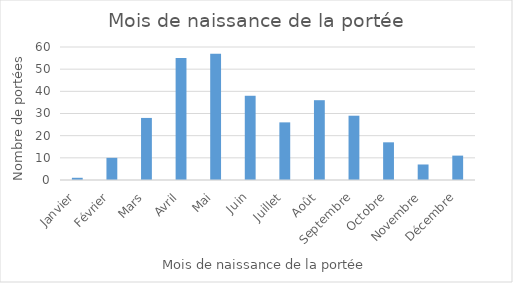
| Category | Series 0 |
|---|---|
| Janvier | 1 |
| Février | 10 |
| Mars | 28 |
| Avril | 55 |
| Mai | 57 |
| Juin | 38 |
| Juillet | 26 |
| Août | 36 |
| Septembre | 29 |
| Octobre | 17 |
| Novembre | 7 |
| Décembre | 11 |